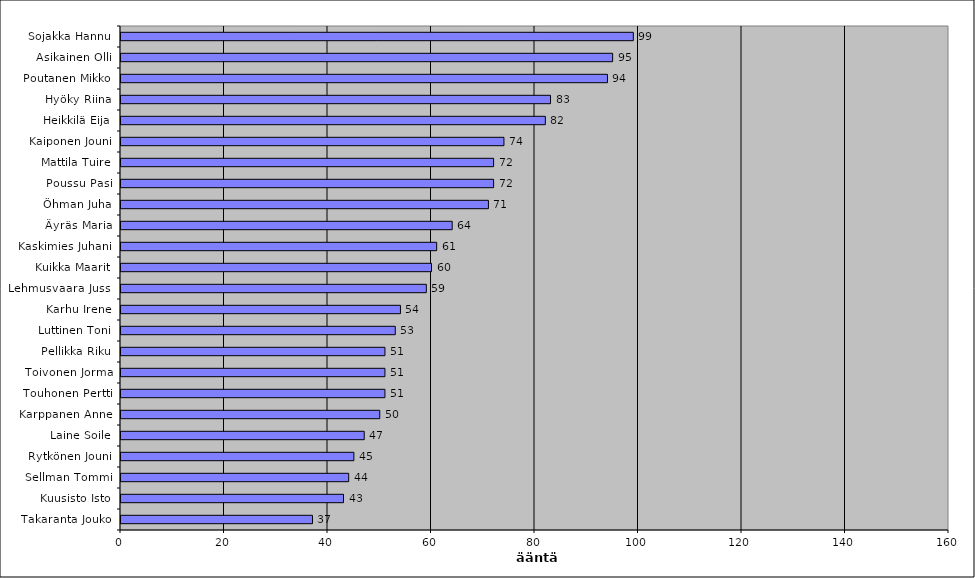
| Category | Series 0 |
|---|---|
| Sojakka Hannu | 99 |
| Asikainen Olli | 95 |
| Poutanen Mikko | 94 |
| Hyöky Riina | 83 |
| Heikkilä Eija | 82 |
| Kaiponen Jouni | 74 |
| Mattila Tuire | 72 |
| Poussu Pasi | 72 |
| Öhman Juha | 71 |
| Äyräs Maria | 64 |
| Kaskimies Juhani | 61 |
| Kuikka Maarit | 60 |
| Lehmusvaara Jussi | 59 |
| Karhu Irene | 54 |
| Luttinen Toni | 53 |
| Pellikka Riku | 51 |
| Toivonen Jorma | 51 |
| Touhonen Pertti | 51 |
| Karppanen Anne | 50 |
| Laine Soile | 47 |
| Rytkönen Jouni | 45 |
| Sellman Tommi | 44 |
| Kuusisto Isto | 43 |
| Takaranta Jouko | 37 |